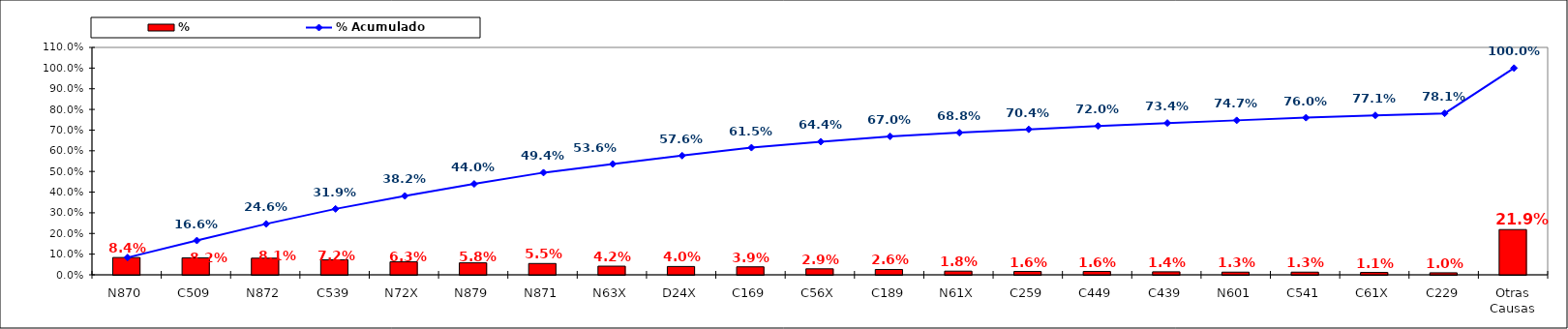
| Category | % |
|---|---|
| N870 | 0.084 |
| C509 | 0.082 |
| N872 | 0.081 |
| C539 | 0.072 |
| N72X | 0.063 |
| N879 | 0.058 |
| N871 | 0.055 |
| N63X | 0.042 |
| D24X | 0.04 |
| C169 | 0.039 |
| C56X | 0.029 |
| C189 | 0.026 |
| N61X | 0.018 |
| C259 | 0.016 |
| C449 | 0.016 |
| C439 | 0.014 |
| N601 | 0.013 |
| C541 | 0.013 |
| C61X | 0.011 |
| C229 | 0.01 |
| Otras Causas | 0.219 |